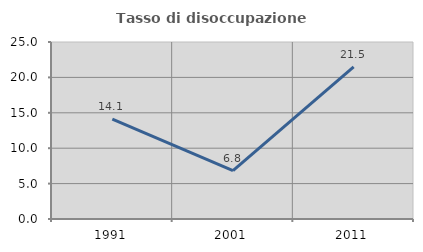
| Category | Tasso di disoccupazione giovanile  |
|---|---|
| 1991.0 | 14.114 |
| 2001.0 | 6.818 |
| 2011.0 | 21.488 |